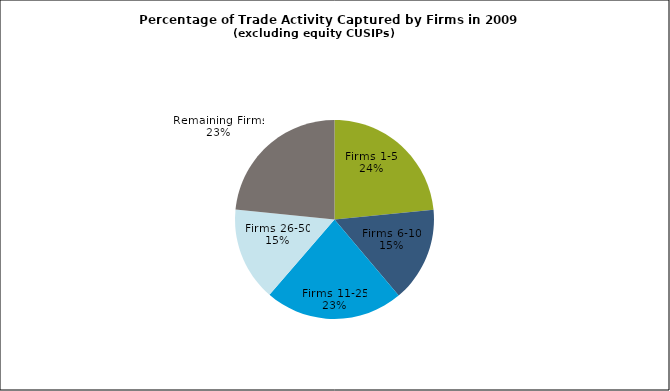
| Category | Series 0 |
|---|---|
| Firms 1-5 | 0.234 |
| Firms 6-10 | 0.154 |
| Firms 11-25 | 0.225 |
| Firms 26-50 | 0.152 |
| Remaining Firms | 0.234 |